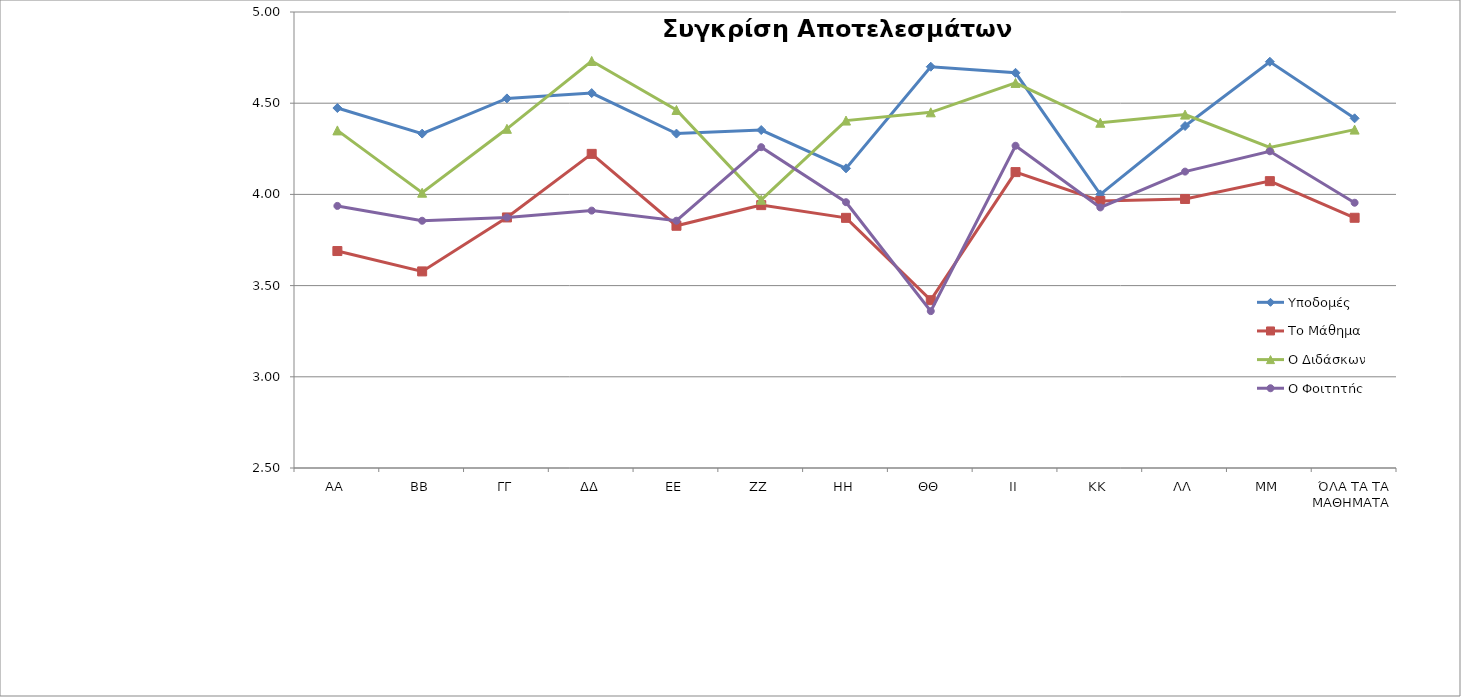
| Category | Υποδομές | Το Μάθημα | Ο Διδάσκων | Ο Φοιτητής |
|---|---|---|---|---|
| ΑΑ | 4.474 | 3.689 | 4.351 | 3.937 |
| ΒΒ | 4.333 | 3.578 | 4.009 | 3.856 |
| ΓΓ | 4.526 | 3.874 | 4.36 | 3.874 |
| ΔΔ | 4.556 | 4.222 | 4.731 | 3.911 |
| ΕΕ | 4.333 | 3.828 | 4.463 | 3.856 |
| ΖΖ | 4.353 | 3.941 | 3.971 | 4.259 |
| ΗΗ | 4.143 | 3.871 | 4.405 | 3.957 |
| ΘΘ | 4.7 | 3.42 | 4.45 | 3.36 |
| ΙΙ | 4.667 | 4.122 | 4.611 | 4.267 |
| ΚΚ | 4 | 3.964 | 4.393 | 3.929 |
| ΛΛ | 4.375 | 3.975 | 4.438 | 4.125 |
| ΜΜ | 4.727 | 4.073 | 4.258 | 4.236 |
| ΌΛΑ ΤΑ ΤΑ ΜΑΘΗΜΑΤΑ  | 4.417 | 3.872 | 4.355 | 3.954 |